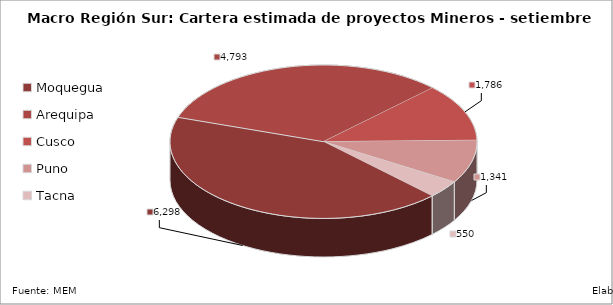
| Category | Series 0 |
|---|---|
| Moquegua | 6298 |
| Arequipa | 4793 |
| Cusco | 1786 |
| Puno | 1341 |
| Tacna | 550 |